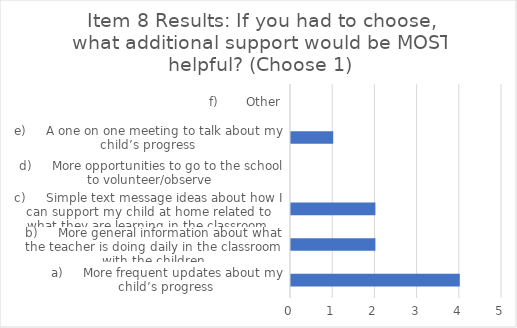
| Category | 8) If you had to choose, what additional support would be MOST helpful? (Choose 1) |
|---|---|
| a)     More frequent updates about my child’s progress | 4 |
| b)     More general information about what the teacher is doing daily in the classroom with the children | 2 |
| c)     Simple text message ideas about how I can support my child at home related to what they are learning in the classroom | 2 |
| d)     More opportunities to go to the school to volunteer/observe | 0 |
| e)     A one on one meeting to talk about my child’s progress | 1 |
| f)       Other | 0 |